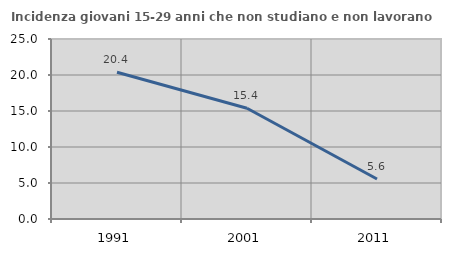
| Category | Incidenza giovani 15-29 anni che non studiano e non lavorano  |
|---|---|
| 1991.0 | 20.379 |
| 2001.0 | 15.385 |
| 2011.0 | 5.556 |